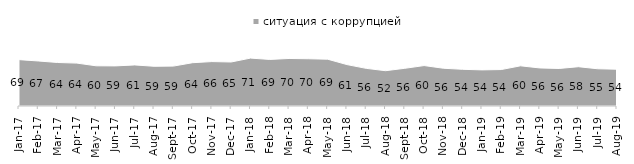
| Category | ситуация с коррупцией |
|---|---|
| 2017-01-01 | 68.7 |
| 2017-02-01 | 66.7 |
| 2017-03-01 | 64.45 |
| 2017-04-01 | 63.55 |
| 2017-05-01 | 59.55 |
| 2017-06-01 | 59.4 |
| 2017-07-01 | 60.85 |
| 2017-08-01 | 58.85 |
| 2017-09-01 | 59.1 |
| 2017-10-01 | 64.15 |
| 2017-11-01 | 65.8 |
| 2017-12-01 | 65.2 |
| 2018-01-01 | 70.95 |
| 2018-02-01 | 69 |
| 2018-03-01 | 70.4 |
| 2018-04-01 | 70 |
| 2018-05-01 | 69.35 |
| 2018-06-01 | 61.35 |
| 2018-07-01 | 55.75 |
| 2018-08-01 | 52.3 |
| 2018-09-01 | 55.85 |
| 2018-10-01 | 59.9 |
| 2018-11-01 | 55.938 |
| 2018-12-01 | 54.35 |
| 2019-01-01 | 53.5 |
| 2019-02-01 | 54 |
| 2019-03-01 | 59.523 |
| 2019-04-01 | 56.386 |
| 2019-05-01 | 55.622 |
| 2019-06-01 | 58.204 |
| 2019-07-01 | 55.149 |
| 2019-08-01 | 54.496 |